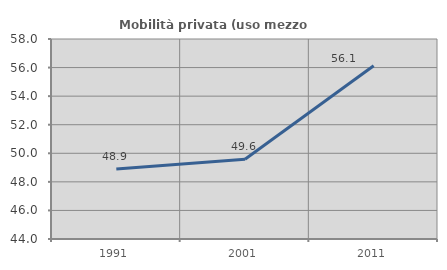
| Category | Mobilità privata (uso mezzo privato) |
|---|---|
| 1991.0 | 48.896 |
| 2001.0 | 49.588 |
| 2011.0 | 56.126 |